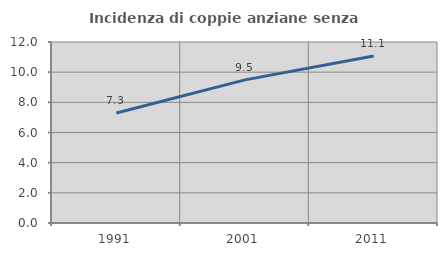
| Category | Incidenza di coppie anziane senza figli  |
|---|---|
| 1991.0 | 7.298 |
| 2001.0 | 9.488 |
| 2011.0 | 11.07 |